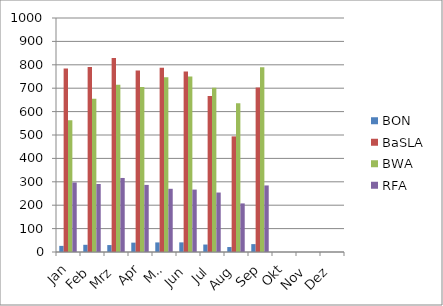
| Category | BON | BaSLA | BWA | RFA |
|---|---|---|---|---|
| Jan | 26.182 | 784.273 | 562.545 | 297.091 |
| Feb | 30.8 | 790.7 | 655.15 | 290.7 |
| Mrz | 29.65 | 829.45 | 714.9 | 316.4 |
| Apr | 40 | 775.19 | 705 | 286.762 |
| Mai | 40.95 | 787.05 | 746.35 | 270.1 |
| Jun | 41.15 | 771.55 | 750.2 | 266.7 |
| Jul | 31.913 | 666.696 | 702.304 | 254.13 |
| Aug | 21.238 | 494.095 | 635.762 | 207.619 |
| Sep | 33.714 | 703.095 | 789.952 | 284.429 |
| Okt | 0 | 0 | 0 | 0 |
| Nov | 0 | 0 | 0 | 0 |
| Dez | 0 | 0 | 0 | 0 |